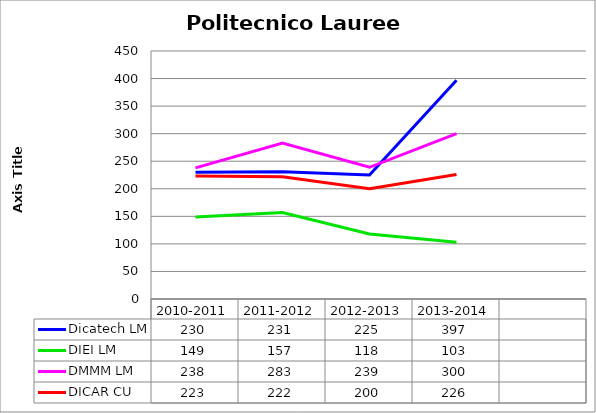
| Category | Dicatech LM | DIEI LM | DMMM LM | DICAR CU |
|---|---|---|---|---|
| 2010-2011 | 230 | 149 | 238 | 223 |
| 2011-2012 | 231 | 157 | 283 | 222 |
| 2012-2013 | 225 | 118 | 239 | 200 |
| 2013-2014 | 397 | 103 | 300 | 226 |